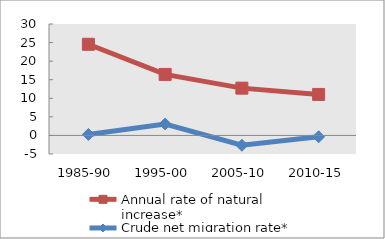
| Category | Annual rate of natural increase* | Crude net migration rate* |
|---|---|---|
| 1985-90 | 24.542 | 0.258 |
| 1995-00 | 16.429 | 3.079 |
| 2005-10 | 12.731 | -2.649 |
| 2010-15 | 11.037 | -0.363 |